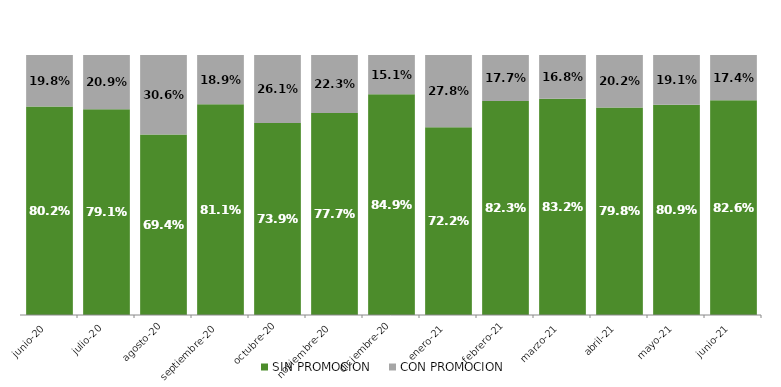
| Category | SIN PROMOCION   | CON PROMOCION   |
|---|---|---|
| 2020-06-01 | 0.802 | 0.198 |
| 2020-07-01 | 0.791 | 0.209 |
| 2020-08-01 | 0.694 | 0.306 |
| 2020-09-01 | 0.811 | 0.189 |
| 2020-10-01 | 0.739 | 0.261 |
| 2020-11-01 | 0.777 | 0.223 |
| 2020-12-01 | 0.849 | 0.151 |
| 2021-01-01 | 0.722 | 0.278 |
| 2021-02-01 | 0.823 | 0.177 |
| 2021-03-01 | 0.832 | 0.168 |
| 2021-04-01 | 0.798 | 0.202 |
| 2021-05-01 | 0.809 | 0.191 |
| 2021-06-01 | 0.826 | 0.174 |